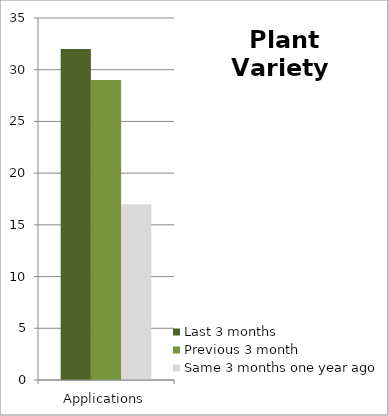
| Category | Last 3 months | Previous 3 month | Same 3 months one year ago |
|---|---|---|---|
| Applications | 32 | 29 | 17 |